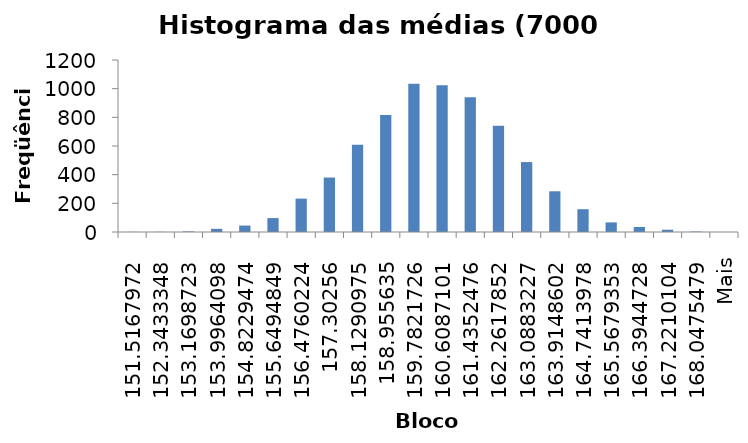
| Category | Freqüência |
|---|---|
| 151.5167972 | 1 |
| 152.3433348 | 1 |
| 153.1698723 | 4 |
| 153.9964098 | 22 |
| 154.8229474 | 45 |
| 155.6494849 | 97 |
| 156.4760224 | 233 |
| 157.30256 | 380 |
| 158.1290975 | 608 |
| 158.955635 | 817 |
| 159.7821726 | 1035 |
| 160.6087101 | 1023 |
| 161.4352476 | 940 |
| 162.2617852 | 742 |
| 163.0883227 | 488 |
| 163.9148602 | 284 |
| 164.7413978 | 159 |
| 165.5679353 | 67 |
| 166.3944728 | 35 |
| 167.2210104 | 16 |
| 168.0475479 | 3 |
| Mais | 0 |